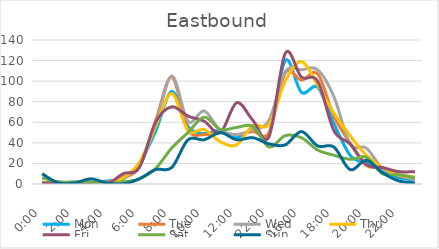
| Category | Mon | Tue | Wed | Thu | Fri | Sat | Sun |
|---|---|---|---|---|---|---|---|
| 0.0 | 1 | 0 | 0 | 2 | 1 | 6 | 10 |
| 0.041667 | 2 | 0 | 0 | 0 | 1 | 2 | 1 |
| 0.083333 | 0 | 0 | 2 | 1 | 0 | 2 | 1 |
| 0.125 | 0 | 0 | 0 | 1 | 1 | 2 | 5 |
| 0.166667 | 3 | 2 | 1 | 1 | 0 | 0 | 1 |
| 0.208333 | 5 | 6 | 7 | 6 | 10 | 2 | 0 |
| 0.25 | 20 | 17 | 17 | 21 | 16 | 5 | 5 |
| 0.291667 | 51 | 61 | 57 | 56 | 60 | 15 | 14 |
| 0.333333 | 90 | 104 | 105 | 88 | 75 | 35 | 16 |
| 0.375 | 56 | 53 | 61 | 52 | 66 | 50 | 43 |
| 0.416667 | 49 | 48 | 71 | 53 | 61 | 65 | 43 |
| 0.458333 | 52 | 50 | 52 | 41 | 50 | 53 | 50 |
| 0.5 | 45 | 48 | 48 | 38 | 79 | 55 | 43 |
| 0.541667 | 53 | 51 | 53 | 57 | 62 | 56 | 45 |
| 1900-01-02 22:00:00 | 49 | 50 | 62 | 58 | 46 | 36 | 39 |
| 0.625 | 120 | 108 | 109 | 100 | 127 | 47 | 38 |
| 0.666667 | 89 | 101 | 111 | 119 | 104 | 45 | 51 |
| 0.708333 | 94 | 107 | 111 | 96 | 100 | 33 | 37 |
| 0.75 | 59 | 66 | 85 | 69 | 52 | 28 | 36 |
| 0.791667 | 28 | 40 | 39 | 47 | 39 | 24 | 14 |
| 0.833333 | 20 | 18 | 35 | 28 | 19 | 26 | 23 |
| 0.875 | 13 | 16 | 15 | 16 | 16 | 10 | 11 |
| 0.916667 | 6 | 8 | 9 | 9 | 12 | 9 | 3 |
| 0.958333 | 4 | 5 | 4 | 7 | 12 | 6 | 1 |